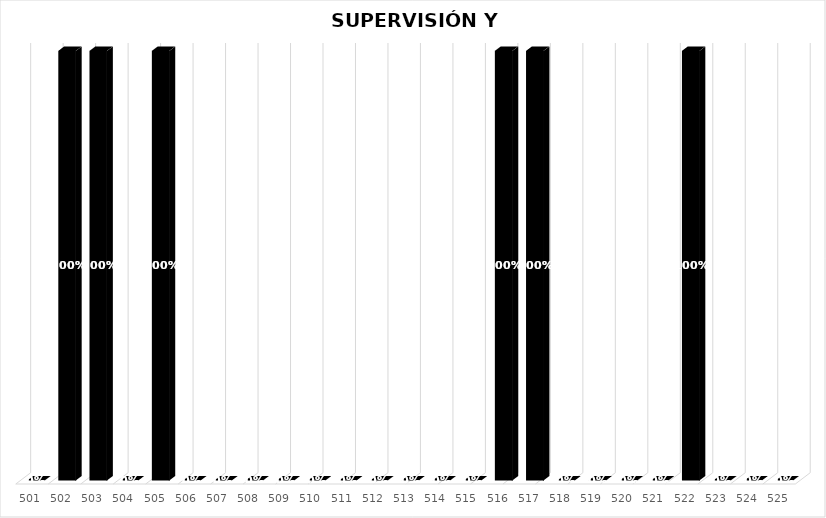
| Category | % Avance |
|---|---|
| 501.0 | 0 |
| 502.0 | 1 |
| 503.0 | 1 |
| 504.0 | 0 |
| 505.0 | 1 |
| 506.0 | 0 |
| 507.0 | 0 |
| 508.0 | 0 |
| 509.0 | 0 |
| 510.0 | 0 |
| 511.0 | 0 |
| 512.0 | 0 |
| 513.0 | 0 |
| 514.0 | 0 |
| 515.0 | 0 |
| 516.0 | 1 |
| 517.0 | 1 |
| 518.0 | 0 |
| 519.0 | 0 |
| 520.0 | 0 |
| 521.0 | 0 |
| 522.0 | 1 |
| 523.0 | 0 |
| 524.0 | 0 |
| 525.0 | 0 |